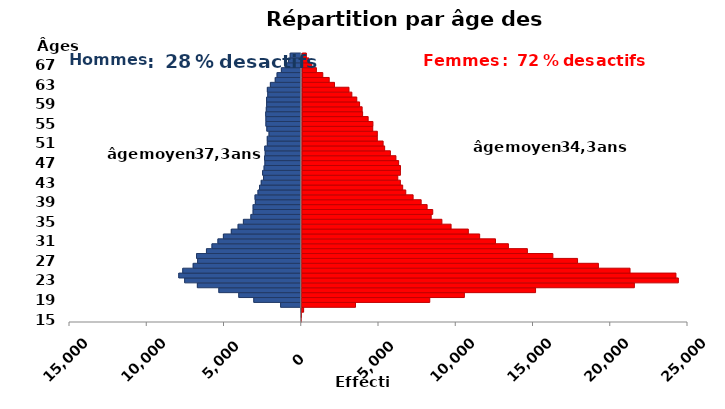
| Category | âge  | Hommes | Femmes |
|---|---|---|---|
| 15.0 | 15 | 0 | 1 |
| 16.0 | 16 | -6 | 28 |
| 17.0 | 17 | -47 | 170 |
| 18.0 | 18 | -1334 | 3526 |
| 19.0 | 19 | -3070 | 8332 |
| 20.0 | 20 | -4042 | 10571 |
| 21.0 | 21 | -5331 | 15178 |
| 22.0 | 22 | -6723 | 21572 |
| 23.0 | 23 | -7545 | 24417 |
| 24.0 | 24 | -7926 | 24260 |
| 25.0 | 25 | -7667 | 21288 |
| 26.0 | 26 | -6993 | 19240 |
| 27.0 | 27 | -6705 | 17889 |
| 28.0 | 28 | -6777 | 16291 |
| 29.0 | 29 | -6135 | 14640 |
| 30.0 | 30 | -5776 | 13410 |
| 31.0 | 31 | -5391 | 12574 |
| 32.0 | 32 | -5038 | 11548 |
| 33.0 | 33 | -4526 | 10814 |
| 34.0 | 34 | -4085 | 9696 |
| 35.0 | 35 | -3743 | 9101 |
| 36.0 | 36 | -3259 | 8407 |
| 37.0 | 37 | -3115 | 8506 |
| 38.0 | 38 | -3113 | 8141 |
| 39.0 | 39 | -2970 | 7755 |
| 40.0 | 40 | -2988 | 7233 |
| 41.0 | 41 | -2798 | 6757 |
| 42.0 | 42 | -2699 | 6556 |
| 43.0 | 43 | -2588 | 6405 |
| 44.0 | 44 | -2440 | 6237 |
| 45.0 | 45 | -2502 | 6406 |
| 46.0 | 46 | -2403 | 6409 |
| 47.0 | 47 | -2350 | 6288 |
| 48.0 | 48 | -2376 | 6113 |
| 49.0 | 49 | -2331 | 5753 |
| 50.0 | 50 | -2361 | 5380 |
| 51.0 | 51 | -2195 | 5280 |
| 52.0 | 52 | -2198 | 4903 |
| 53.0 | 53 | -2084 | 4904 |
| 54.0 | 54 | -2227 | 4606 |
| 55.0 | 55 | -2285 | 4617 |
| 56.0 | 56 | -2286 | 4307 |
| 57.0 | 57 | -2299 | 3947 |
| 58.0 | 58 | -2261 | 3916 |
| 59.0 | 59 | -2242 | 3749 |
| 60.0 | 60 | -2245 | 3567 |
| 61.0 | 61 | -2166 | 3247 |
| 62.0 | 62 | -2193 | 3059 |
| 63.0 | 63 | -1997 | 2122 |
| 64.0 | 64 | -1682 | 1778 |
| 65.0 | 65 | -1563 | 1361 |
| 66.0 | 66 | -1286 | 946 |
| 67.0 | 67 | -1024 | 647 |
| 68.0 | 68 | -827 | 452 |
| 69.0 | 69 | -715 | 293 |